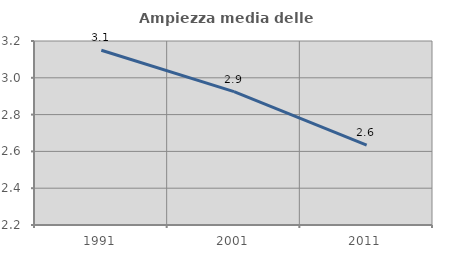
| Category | Ampiezza media delle famiglie |
|---|---|
| 1991.0 | 3.15 |
| 2001.0 | 2.925 |
| 2011.0 | 2.635 |